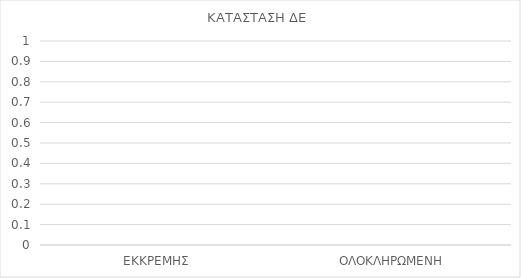
| Category | ΠΛΗΘΟΣ |
|---|---|
| ΗΤΑΝ ΑΠΟΤΕΛΕΣΜΑΤΙΚΗ | 0 |
| ΑΠΑΙΤΕΙΤΑΙ ΝΕΑ ΕΝΕΡΓΕΙΑ | 0 |